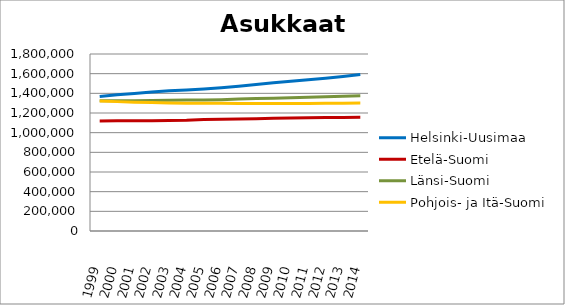
| Category | Helsinki-Uusimaa | Etelä-Suomi | Länsi-Suomi | Pohjois- ja Itä-Suomi |
|---|---|---|---|---|
| 1999.0 | 1367973 | 1119141 | 1324963 | 1321944 |
| 2000.0 | 1384989 | 1120065 | 1324857 | 1315685 |
| 2001.0 | 1399452 | 1120521 | 1324984 | 1310382 |
| 2002.0 | 1413734 | 1122378 | 1326963 | 1305818 |
| 2003.0 | 1425160 | 1124008 | 1329061 | 1301809 |
| 2004.0 | 1435078 | 1125872 | 1332612 | 1299823 |
| 2005.0 | 1444567 | 1133731 | 1331825 | 1299958 |
| 2006.0 | 1457221 | 1136150 | 1335702 | 1299741 |
| 2007.0 | 1472594 | 1138352 | 1341952 | 1297134 |
| 2008.0 | 1488859 | 1140953 | 1347497 | 1296022 |
| 2009.0 | 1506634 | 1147144 | 1349600 | 1295480 |
| 2010.0 | 1522858 | 1149332 | 1355168 | 1296335 |
| 2011.0 | 1537664 | 1152240 | 1360041 | 1297324 |
| 2012.0 | 1554430 | 1154451 | 1365259 | 1298773 |
| 2013.0 | 1572212 | 1155355 | 1370384 | 1300222 |
| 2014.0 | 1591127 | 1156498 | 1374403 | 1300846 |